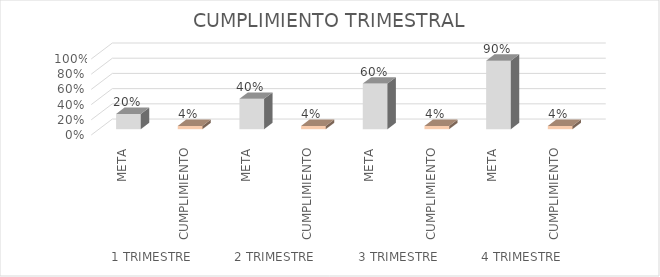
| Category | Series 0 |
|---|---|
| 0 | 0.2 |
| 1 | 0.043 |
| 2 | 0.4 |
| 3 | 0.043 |
| 4 | 0.6 |
| 5 | 0.043 |
| 6 | 0.9 |
| 7 | 0.043 |